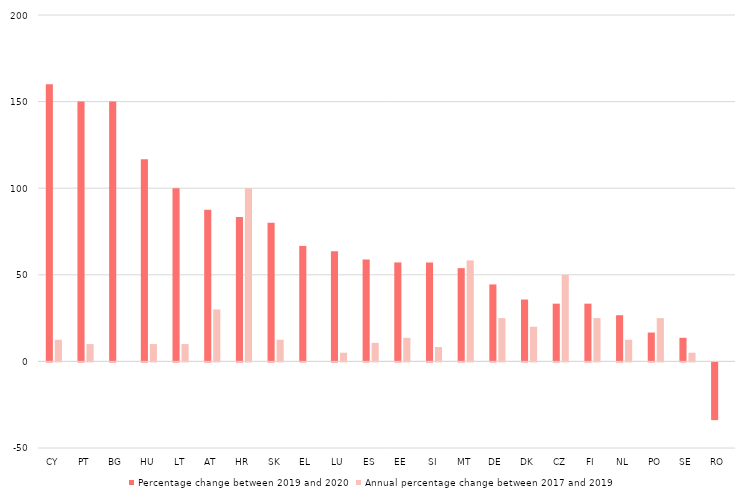
| Category | Percentage change between 2019 and 2020 | Annual percentage change between 2017 and 2019 |
|---|---|---|
| CY | 160 | 12.5 |
| PT | 150 | 10 |
| BG | 150 | 0 |
| HU | 116.667 | 10 |
| LT | 100 | 10 |
| AT | 87.5 | 30 |
| HR | 83.333 | 100 |
| SK | 80 | 12.5 |
| EL | 66.667 | 0 |
| LU | 63.636 | 5 |
| ES | 58.824 | 10.7 |
| EE | 57.143 | 13.6 |
| SI | 57.143 | 8.3 |
| MT | 53.846 | 58.3 |
| DE | 44.444 | 25 |
| DK | 35.714 | 20 |
| CZ | 33.333 | 50 |
| FI | 33.333 | 25 |
| NL | 26.667 | 12.5 |
| PO | 16.667 | 25 |
| SE | 13.636 | 5 |
| RO | -33.333 | 0 |